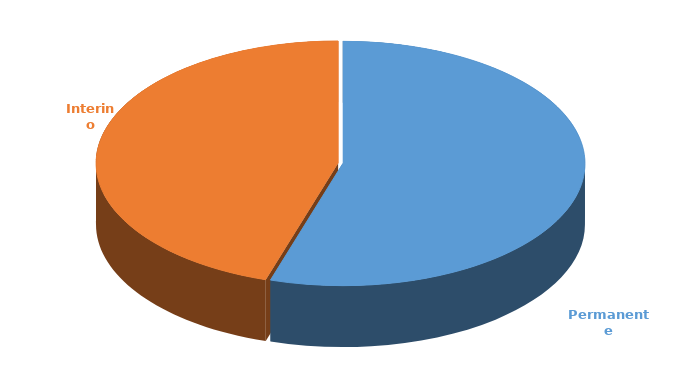
| Category | Cantidad |
|---|---|
| Permanente | 3156 |
| Interino | 2600 |